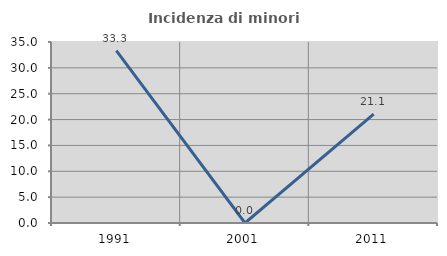
| Category | Incidenza di minori stranieri |
|---|---|
| 1991.0 | 33.333 |
| 2001.0 | 0 |
| 2011.0 | 21.053 |